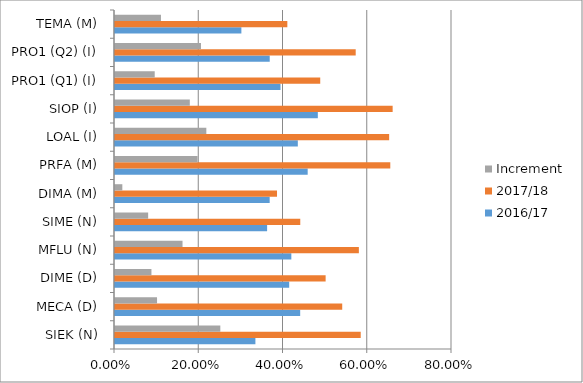
| Category | 2016/17 | 2017/18 | Increment |
|---|---|---|---|
| SIEK (N) | 0.333 | 0.583 | 0.25 |
| MECA (D) | 0.44 | 0.539 | 0.1 |
| DIME (D) | 0.414 | 0.5 | 0.087 |
| MFLU (N) | 0.419 | 0.579 | 0.16 |
| SIME (N) | 0.361 | 0.44 | 0.079 |
| DIMA (M) | 0.367 | 0.385 | 0.017 |
| PRFA (M) | 0.457 | 0.654 | 0.196 |
| LOAL (I) | 0.434 | 0.651 | 0.217 |
| SIOP (I) | 0.482 | 0.659 | 0.178 |
| PRO1 (Q1) (I) | 0.393 | 0.487 | 0.094 |
| PRO1 (Q2) (I) | 0.367 | 0.571 | 0.204 |
| TEMA (M) | 0.3 | 0.409 | 0.109 |